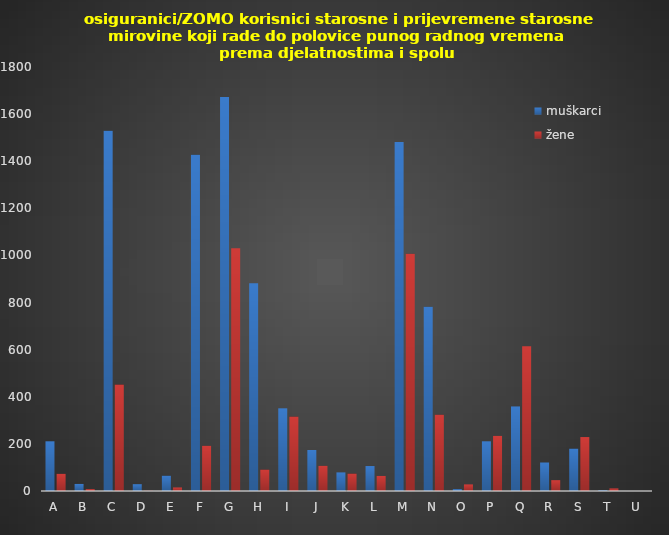
| Category | muškarci | žene |
|---|---|---|
| A | 211 | 73 |
| B | 30 | 8 |
| C | 1529 | 452 |
| D | 29 | 1 |
| E | 65 | 15 |
| F | 1427 | 192 |
| G | 1673 | 1031 |
| H | 882 | 91 |
| I | 351 | 316 |
| J | 174 | 107 |
| K | 79 | 74 |
| L | 106 | 64 |
| M | 1482 | 1007 |
| N | 782 | 324 |
| O | 8 | 28 |
| P | 211 | 234 |
| Q | 359 | 615 |
| R | 121 | 46 |
| S | 180 | 229 |
| T | 3 | 11 |
| U | 0 | 0 |